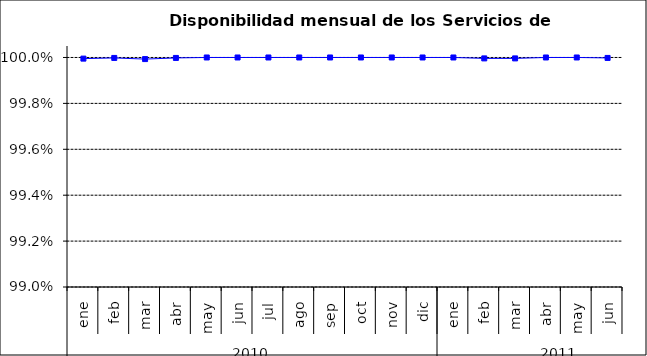
| Category | SCL * |
|---|---|
| 0 | 1 |
| 1 | 1 |
| 2 | 1 |
| 3 | 1 |
| 4 | 1 |
| 5 | 1 |
| 6 | 1 |
| 7 | 1 |
| 8 | 1 |
| 9 | 1 |
| 10 | 1 |
| 11 | 1 |
| 12 | 1 |
| 13 | 1 |
| 14 | 1 |
| 15 | 1 |
| 16 | 1 |
| 17 | 1 |